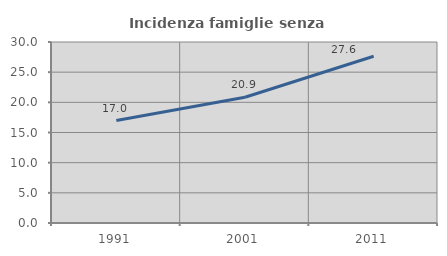
| Category | Incidenza famiglie senza nuclei |
|---|---|
| 1991.0 | 16.986 |
| 2001.0 | 20.85 |
| 2011.0 | 27.647 |